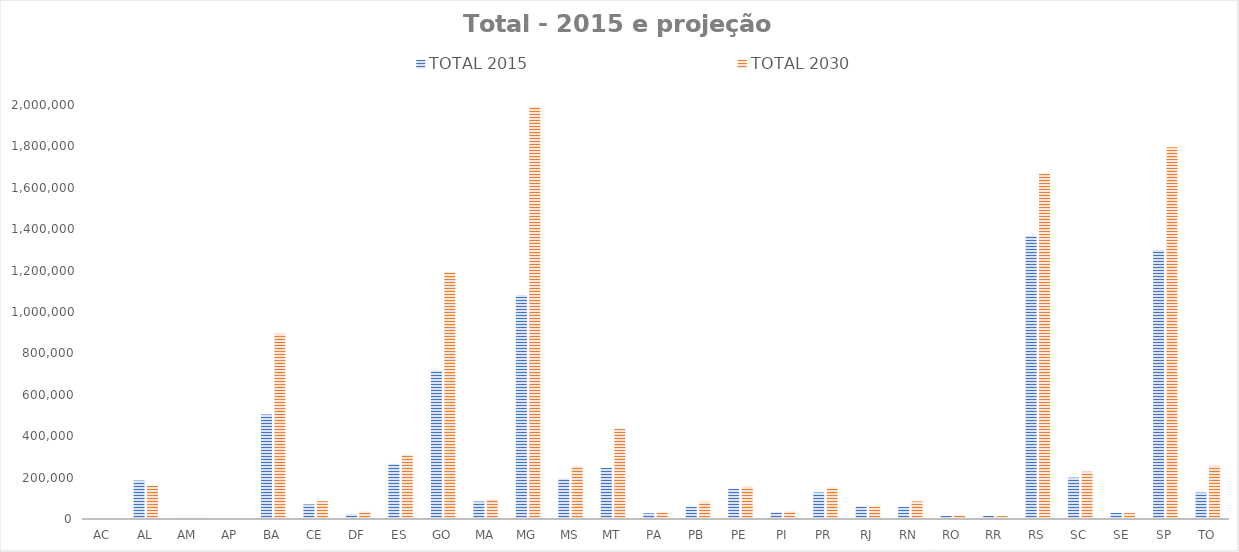
| Category | TOTAL 2015 | TOTAL 2030 |
|---|---|---|
| AC | 1481 | 1541 |
| AL | 185717 | 160304 |
| AM | 5386 | 5615 |
| AP | 2413 | 2684 |
| BA | 504780 | 894863 |
| CE | 70449 | 86007 |
| DF | 22894 | 35870 |
| ES | 266635 | 310001 |
| GO | 717484 | 1193102 |
| MA | 84575 | 93865 |
| MG | 1082374 | 1993225 |
| MS | 196230 | 254874 |
| MT | 247365 | 436458 |
| PA | 27285 | 31808 |
| PB | 59358 | 82878 |
| PE | 146169 | 155399 |
| PI | 32266 | 36256 |
| PR | 127887 | 152489 |
| RJ | 60287 | 61380 |
| RN | 57999 | 85247 |
| RO | 15231 | 16501 |
| RR | 14403 | 13720 |
| RS | 1368327 | 1669157 |
| SC | 200020 | 228750 |
| SE | 29845 | 28418 |
| SP | 1300046 | 1796211 |
| TO | 127804 | 256828 |